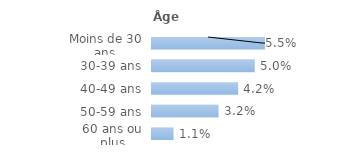
| Category | Series 0 |
|---|---|
| Moins de 30 ans | 0.055 |
| 30-39 ans | 0.05 |
| 40-49 ans | 0.042 |
| 50-59 ans | 0.032 |
| 60 ans ou plus | 0.011 |